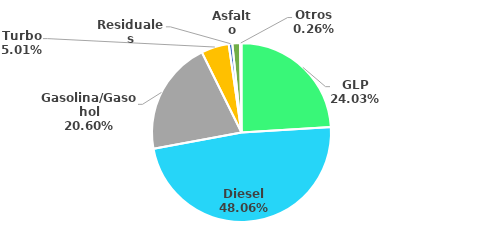
| Category | MBPD |
|---|---|
| GLP | 66.74 |
| Diesel | 133.503 |
| Gasolina/Gasohol | 57.23 |
| Turbo | 13.902 |
| Residuales | 1.83 |
| Asfalto | 3.824 |
| Otros | 0.735 |